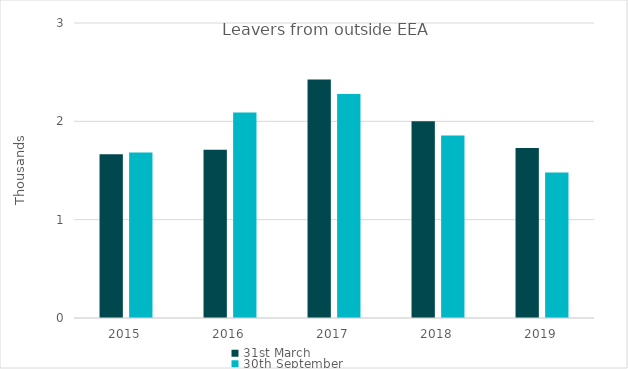
| Category | 31st March | 30th September |
|---|---|---|
| 2015.0 | 1664 | 1684 |
| 2016.0 | 1710 | 2090 |
| 2017.0 | 2426 | 2277 |
| 2018.0 | 2002 | 1857 |
| 2019.0 | 1730 | 1480 |